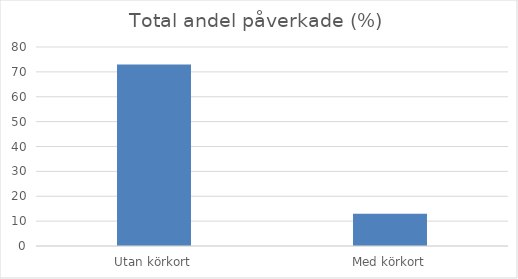
| Category | Andel % |
|---|---|
| Utan körkort | 73 |
| Med körkort | 13 |